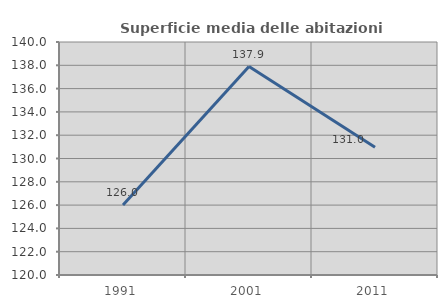
| Category | Superficie media delle abitazioni occupate |
|---|---|
| 1991.0 | 126.014 |
| 2001.0 | 137.89 |
| 2011.0 | 130.964 |